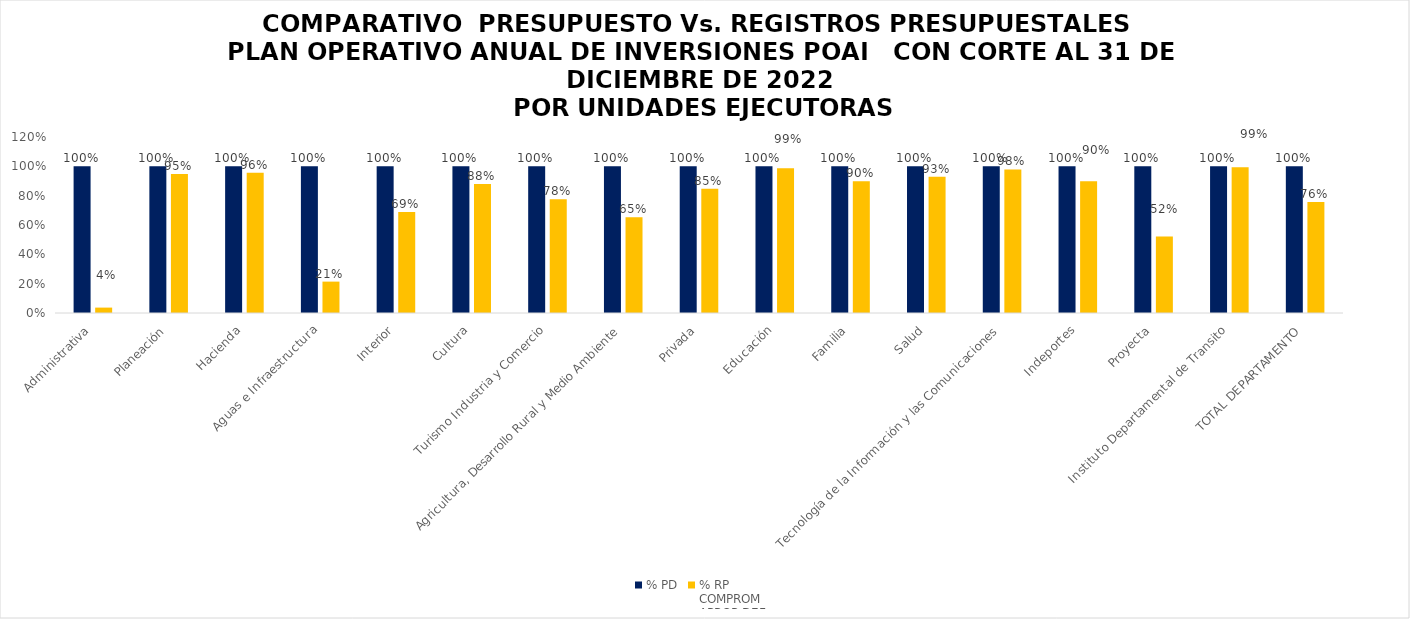
| Category |  % PD  |  % RP
COMPROM
APROP DEF  |
|---|---|---|
| Administrativa | 1 | 0.037 |
| Planeación | 1 | 0.948 |
| Hacienda | 1 | 0.956 |
| Aguas e Infraestructura | 1 | 0.214 |
| Interior | 1 | 0.688 |
| Cultura | 1 | 0.88 |
| Turismo Industria y Comercio | 1 | 0.776 |
| Agricultura, Desarrollo Rural y Medio Ambiente | 1 | 0.653 |
| Privada | 1 | 0.848 |
| Educación | 1 | 0.987 |
| Familia | 1 | 0.898 |
| Salud | 1 | 0.93 |
| Tecnología de la Información y las Comunicaciones | 1 | 0.979 |
| Indeportes | 1 | 0.899 |
| Proyecta | 1 | 0.521 |
| Instituto Departamental de Transito | 1 | 0.994 |
| TOTAL DEPARTAMENTO | 1 | 0.758 |